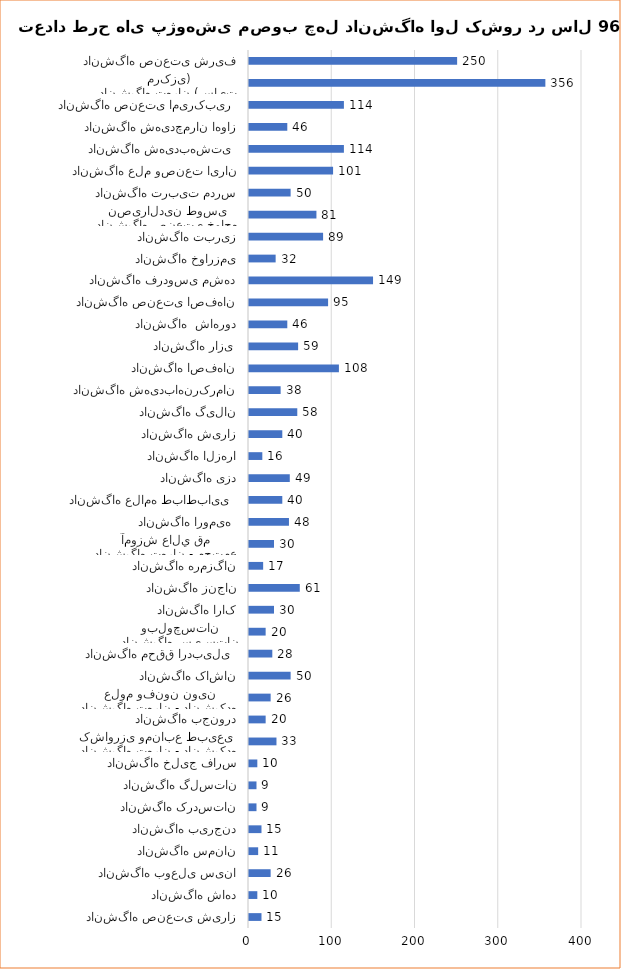
| Category | تعداد طرح پژوهشی مصوب 96 |
|---|---|
| دانشگاه صنعتی شیراز | 15 |
| دانشگاه شاهد | 10 |
| دانشگاه بوعلی سینا | 26 |
| دانشگاه سمنان | 11 |
| دانشگاه بیرجند | 15 |
| دانشگاه کردستان | 9 |
| دانشگاه گلستان | 9 |
| دانشگاه خلیج فارس | 10 |
| دانشگاه تهران - دانشکده کشاورزی ومنابع طبیعی  | 33 |
| دانشگاه بجنورد | 20 |
| دانشگاه تهران - دانشکده علوم وفنون نوین | 26 |
| دانشگاه کاشان | 50 |
| دانشگاه محقق اردبیلی  | 28 |
| دانشگاه سیستان وبلوچستان | 20 |
| دانشگاه اراک | 30 |
| دانشگاه زنجان | 61 |
| دانشگاه هرمزگان | 17 |
| دانشگاه تهران - مجتمع آموزش عالي قم | 30 |
| دانشگاه ارومیه  | 48 |
| دانشگاه علامه طباطبایی  | 40 |
| دانشگاه یزد | 49 |
| دانشگاه الزهرا | 16 |
| دانشگاه شیراز | 40 |
| دانشگاه گیلان | 58 |
| دانشگاه شهیدباهنرکرمان | 38 |
| دانشگاه اصفهان | 108 |
| دانشگاه رازی  | 59 |
| دانشگاه  شاهرود | 46 |
| دانشگاه صنعتی اصفهان | 95 |
| دانشگاه فردوسی مشهد | 149 |
| دانشگاه خوارزمی | 32 |
| دانشگاه تبریز | 89 |
| دانشگاه صنعتی خواجه نصیرالدین طوسی | 81 |
| دانشگاه تربیت مدرس | 50 |
| دانشگاه علم وصنعت ایران | 101 |
| دانشگاه شهیدبهشتی  | 114 |
| دانشگاه شهیدچمران اهواز | 46 |
| دانشگاه صنعتی امیرکبیر  | 114 |
| دانشگاه تهران (سایت مرکزی) | 356 |
| دانشگاه صنعتی شریف | 250 |